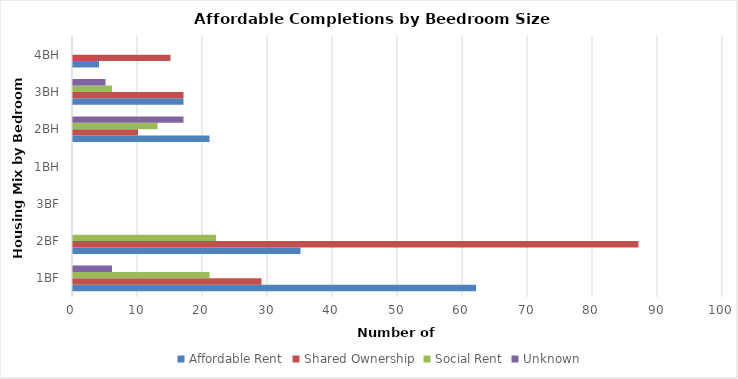
| Category | Affordable Rent | Shared Ownership | Social Rent | Unknown |
|---|---|---|---|---|
| 1BF | 62 | 29 | 21 | 6 |
| 2BF | 35 | 87 | 22 | 0 |
| 3BF | 0 | 0 | 0 | 0 |
| 1BH | 0 | 0 | 0 | 0 |
| 2BH | 21 | 10 | 13 | 17 |
| 3BH | 17 | 17 | 6 | 5 |
| 4BH | 4 | 15 | 0 | 0 |